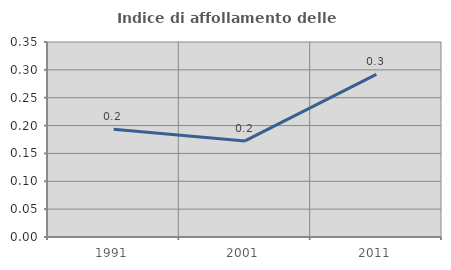
| Category | Indice di affollamento delle abitazioni  |
|---|---|
| 1991.0 | 0.193 |
| 2001.0 | 0.172 |
| 2011.0 | 0.292 |